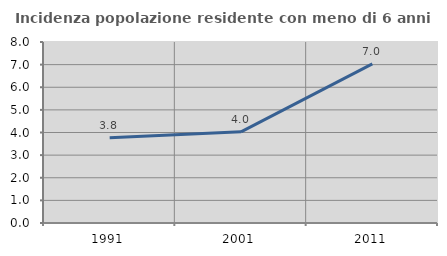
| Category | Incidenza popolazione residente con meno di 6 anni |
|---|---|
| 1991.0 | 3.768 |
| 2001.0 | 4.03 |
| 2011.0 | 7.034 |